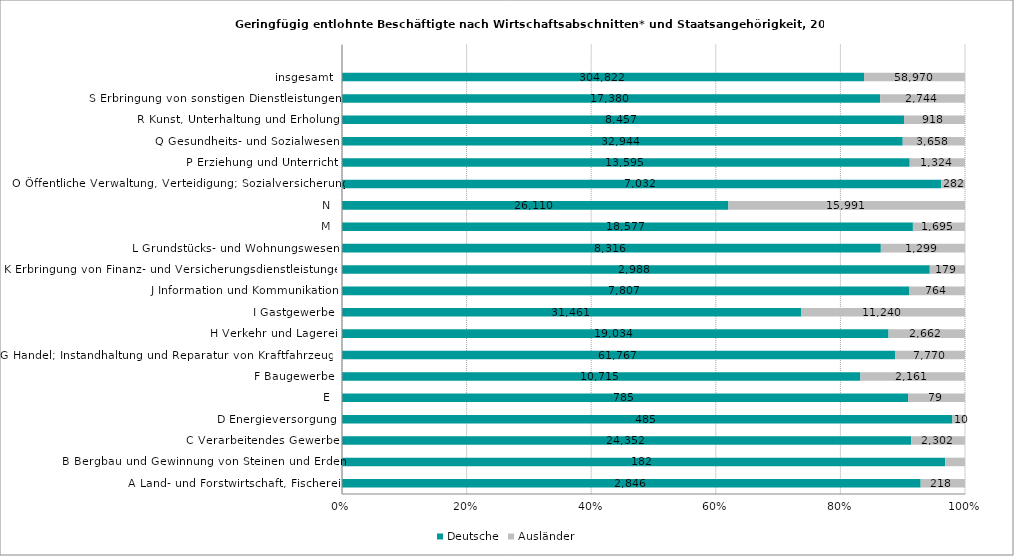
| Category | Deutsche | Ausländer |
|---|---|---|
| A Land- und Forstwirtschaft, Fischerei | 2846 | 218 |
| B Bergbau und Gewinnung von Steinen und Erden | 182 | 6 |
| C Verarbeitendes Gewerbe | 24352 | 2302 |
| D Energieversorgung | 485 | 10 |
| E | 785 | 79 |
| F Baugewerbe | 10715 | 2161 |
| G Handel; Instandhaltung und Reparatur von Kraftfahrzeugen | 61767 | 7770 |
| H Verkehr und Lagerei | 19034 | 2662 |
| I Gastgewerbe | 31461 | 11240 |
| J Information und Kommunikation | 7807 | 764 |
| K Erbringung von Finanz- und Versicherungsdienstleistungen | 2988 | 179 |
| L Grundstücks- und Wohnungswesen | 8316 | 1299 |
| M | 18577 | 1695 |
| N | 26110 | 15991 |
| O Öffentliche Verwaltung, Verteidigung; Sozialversicherung | 7032 | 282 |
| P Erziehung und Unterricht | 13595 | 1324 |
| Q Gesundheits- und Sozialwesen | 32944 | 3658 |
| R Kunst, Unterhaltung und Erholung | 8457 | 918 |
| S Erbringung von sonstigen Dienstleistungen | 17380 | 2744 |
| insgesamt | 304822 | 58970 |